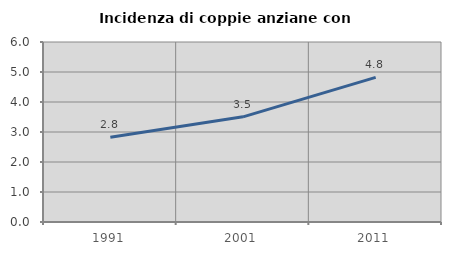
| Category | Incidenza di coppie anziane con figli |
|---|---|
| 1991.0 | 2.828 |
| 2001.0 | 3.506 |
| 2011.0 | 4.823 |